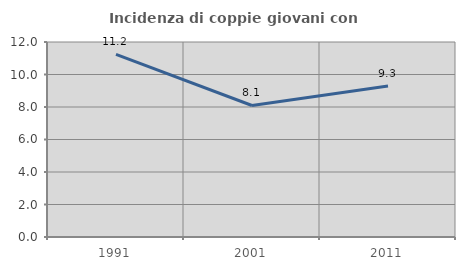
| Category | Incidenza di coppie giovani con figli |
|---|---|
| 1991.0 | 11.243 |
| 2001.0 | 8.092 |
| 2011.0 | 9.29 |